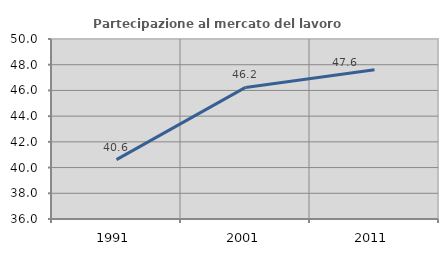
| Category | Partecipazione al mercato del lavoro  femminile |
|---|---|
| 1991.0 | 40.614 |
| 2001.0 | 46.235 |
| 2011.0 | 47.611 |